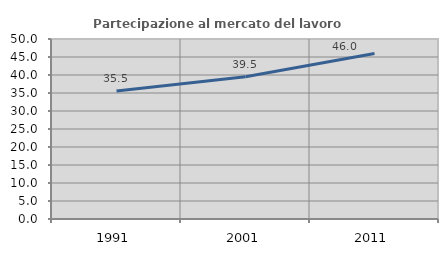
| Category | Partecipazione al mercato del lavoro  femminile |
|---|---|
| 1991.0 | 35.524 |
| 2001.0 | 39.509 |
| 2011.0 | 45.998 |